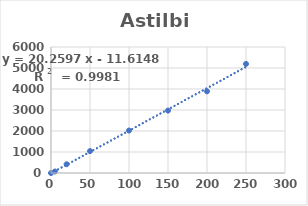
| Category | Series 0 |
|---|---|
| 0.0 | 0 |
| 5.0 | 72.218 |
| 20.0 | 415.592 |
| 50.0 | 1042.831 |
| 100.0 | 2021.347 |
| 150.0 | 2972.772 |
| 200.0 | 3888.874 |
| 250.0 | 5194.704 |